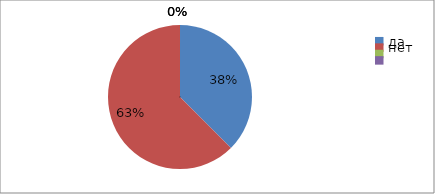
| Category | Series 0 | Series 1 |
|---|---|---|
| да | 37.5 | 37.5 |
| нет | 62.5 | 62.5 |